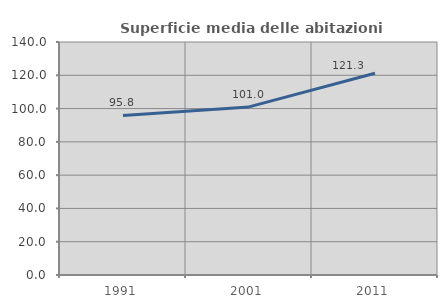
| Category | Superficie media delle abitazioni occupate |
|---|---|
| 1991.0 | 95.841 |
| 2001.0 | 101.007 |
| 2011.0 | 121.255 |